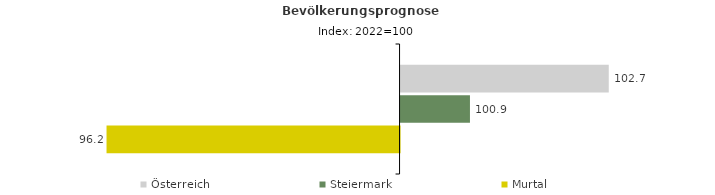
| Category | Österreich | Steiermark | Murtal |
|---|---|---|---|
| 2022.0 | 102.7 | 100.9 | 96.2 |